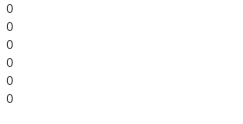
| Category | Series 0 | Series 1 |
|---|---|---|
| 0 | 111 | -7 |
| 1 | 94 | -9 |
| 2 | 76 | -12 |
| 3 | 83 | -12 |
| 4 | 92 | -5 |
| 5 | 73 | -9 |